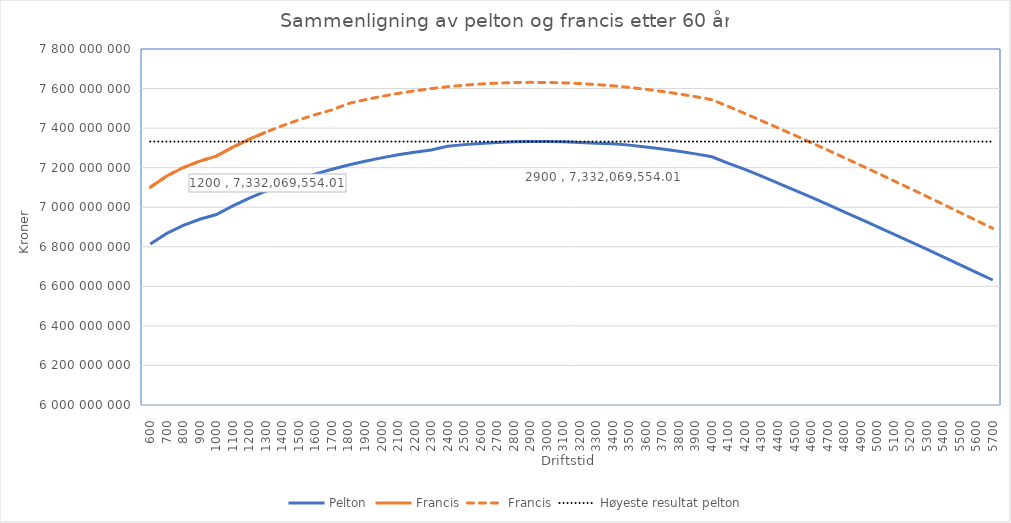
| Category | Pelton | Francis | Høyeste resultat pelton |
|---|---|---|---|
| 600.0 | 6814121673.079 | 7100714441.619 | 7332069554.01 |
| 700.0 | 6867558689.179 | 7157854677.071 | 7332069554.01 |
| 800.0 | 6907960898.686 | 7200644633.916 | 7332069554.01 |
| 900.0 | 6939023355.685 | 7233246390.949 | 7332069554.01 |
| 1000.0 | 6963066090.783 | 7258253740.255 | 7332069554.01 |
| 1100.0 | 7006909515.967 | 7303481354.98 | 7332069554.01 |
| 1200.0 | 7046084855.206 | 7343738038.031 | 7332069554.01 |
| 1300.0 | 7081324537.634 | 7379829344.233 | 7332069554.01 |
| 1400.0 | 7113162017.152 | 7412339139.216 | 7332069554.01 |
| 1500.0 | 7141994610.265 | 7441700325.231 | 7332069554.01 |
| 1600.0 | 7168123866.078 | 7468240071.74 | 7332069554.01 |
| 1700.0 | 7191782367.955 | 7492209715.219 | 7332069554.01 |
| 1800.0 | 7213152037.884 | 7524407032.759 | 7332069554.01 |
| 1900.0 | 7232376949.612 | 7543433040.047 | 7332069554.01 |
| 2000.0 | 7249572494.505 | 7560391189.404 | 7332069554.01 |
| 2100.0 | 7264832065.64 | 7575377347.613 | 7332069554.01 |
| 2200.0 | 7278232016.538 | 7588469546.133 | 7332069554.01 |
| 2300.0 | 7289835397.13 | 7599731938.846 | 7332069554.01 |
| 2400.0 | 7308563672.659 | 7609217816.066 | 7332069554.01 |
| 2500.0 | 7316501569.022 | 7616971929.351 | 7332069554.01 |
| 2600.0 | 7322791615.96 | 7623032305.686 | 7332069554.01 |
| 2700.0 | 7327465156.378 | 7627431678.288 | 7332069554.01 |
| 2800.0 | 7330549655.918 | 7630198626.044 | 7332069554.01 |
| 2900.0 | 7332069554.005 | 7631358488.958 | 7332069554.01 |
| 3000.0 | 7332046954.902 | 7630934109.599 | 7332069554.01 |
| 3100.0 | 7330502192.911 | 7628946438.023 | 7332069554.01 |
| 3200.0 | 7327454297.657 | 7625415028.574 | 7332069554.01 |
| 3300.0 | 7322921379.333 | 7620358450.28 | 7332069554.01 |
| 3400.0 | 7321522322.306 | 7613794627.641 | 7332069554.01 |
| 3500.0 | 7313989460.008 | 7605741124.869 | 7332069554.01 |
| 3600.0 | 7305027050.372 | 7596215383.82 | 7332069554.01 |
| 3700.0 | 7294651987.029 | 7585234923.748 | 7332069554.01 |
| 3800.0 | 7282881431.096 | 7572817509.327 | 7332069554.01 |
| 3900.0 | 7269732942.56 | 7558981292.118 | 7332069554.01 |
| 4000.0 | 7255224591.008 | 7543744929.662 | 7332069554.01 |
| 4100.0 | 7221815405.876 | 7508995445.598 | 7332069554.01 |
| 4200.0 | 7191854022.268 | 7473643346.882 | 7332069554.01 |
| 4300.0 | 7157244962.43 | 7437723340.664 | 7332069554.01 |
| 4400.0 | 7122117607.869 | 7401269825.759 | 7332069554.01 |
| 4500.0 | 7086504934.755 | 7364316927.905 | 7332069554.01 |
| 4600.0 | 7050439696.423 | 7326898527.331 | 7332069554.01 |
| 4700.0 | 7013954441.519 | 7289048279.738 | 7332069554.01 |
| 4800.0 | 6977081526.992 | 7250799631.618 | 7332069554.01 |
| 4900.0 | 6939853126.627 | 7212185830.693 | 7332069554.01 |
| 5000.0 | 6902301235.728 | 7173239932.149 | 7332069554.01 |
| 5100.0 | 6864457672.472 | 7133994801.226 | 7332069554.01 |
| 5200.0 | 6826354076.379 | 7094483112.663 | 7332069554.01 |
| 5300.0 | 6788021904.269 | 7054737347.414 | 7332069554.01 |
| 5400.0 | 6749492424.061 | 7014789786.995 | 7332069554.01 |
| 5500.0 | 6709986315.373 | 6973848115.974 | 7332069554.01 |
| 5600.0 | 6671058825.583 | 6933496110.993 | 7332069554.01 |
| 5700.0 | 6632030515.274 | 6893041797.444 | 7332069554.01 |